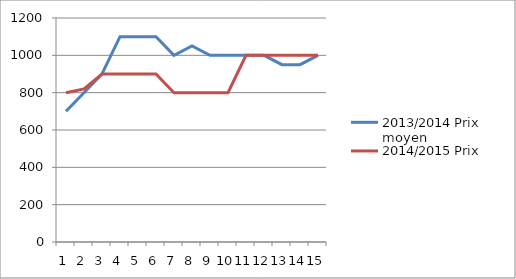
| Category | 2013/2014 Prix moyen | 2014/2015 Prix moyen |
|---|---|---|
| 0 | 700 | 800 |
| 1 | 800 | 820 |
| 2 | 900 | 900 |
| 3 | 1100 | 900 |
| 4 | 1100 | 900 |
| 5 | 1100 | 900 |
| 6 | 1000 | 800 |
| 7 | 1050 | 800 |
| 8 | 1000 | 800 |
| 9 | 1000 | 800 |
| 10 | 1000 | 1000 |
| 11 | 1000 | 1000 |
| 12 | 950 | 1000 |
| 13 | 950 | 1000 |
| 14 | 1000 | 1000 |